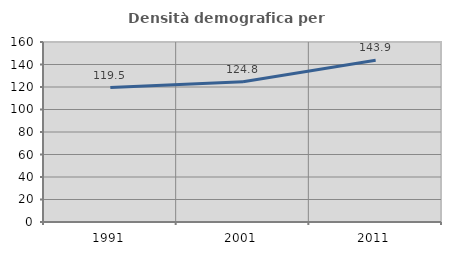
| Category | Densità demografica |
|---|---|
| 1991.0 | 119.493 |
| 2001.0 | 124.754 |
| 2011.0 | 143.857 |